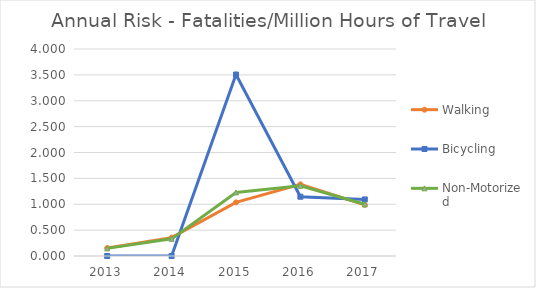
| Category | Walking | Bicycling | Non-Motorized |
|---|---|---|---|
| 2013 | 0.153 | 0 | 0.147 |
| 2014 | 0.355 | 0 | 0.332 |
| 2015 | 1.036 | 3.505 | 1.229 |
| 2016 | 1.385 | 1.146 | 1.357 |
| 2017 | 0.987 | 1.093 | 0.999 |